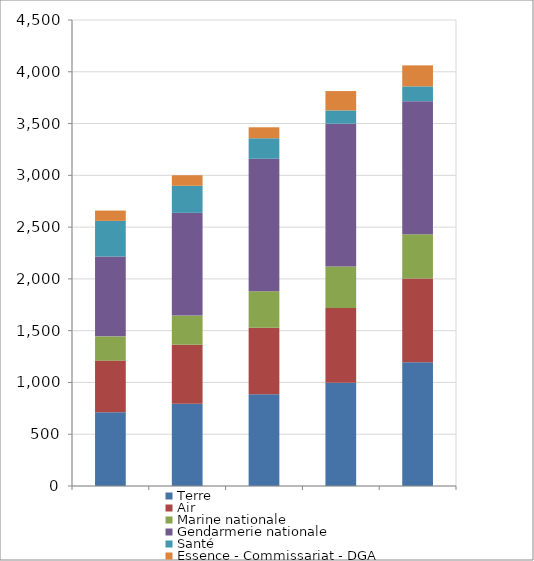
| Category | Terre | Air | Marine nationale | Gendarmerie nationale | Santé | Essence - Commissariat - DGA |
|---|---|---|---|---|---|---|
| 0 | 712 | 499 | 234 | 770 | 345 | 100 |
| 1 | 795 | 569 | 282 | 992 | 261 | 102 |
| 2 | 887 | 640 | 353 | 1280 | 198 | 106 |
| 3 | 998 | 720 | 402 | 1379 | 128 | 187 |
| 4 | 1196 | 808 | 428 | 1284 | 143 | 203 |